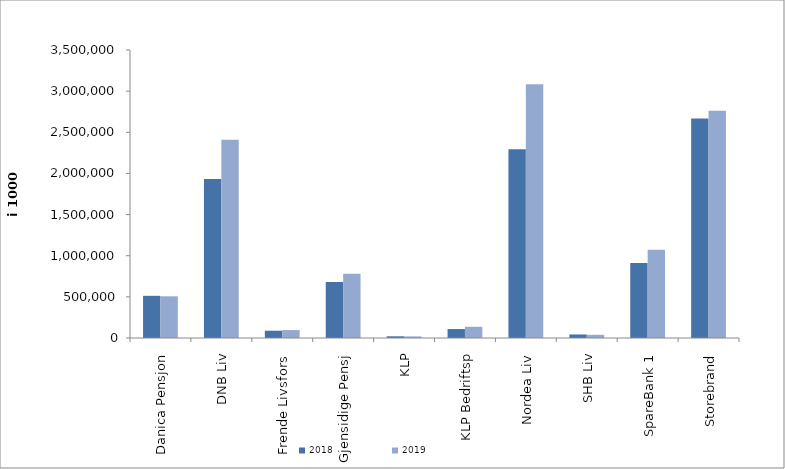
| Category | 2018 | 2019 |
|---|---|---|
| Danica Pensjon | 512553.305 | 506748.042 |
| DNB Liv | 1933331 | 2408062 |
| Frende Livsfors | 88637 | 96311 |
| Gjensidige Pensj | 681493 | 781465 |
| KLP | 20875.778 | 19489.256 |
| KLP Bedriftsp | 108569 | 135943 |
| Nordea Liv | 2294973.036 | 3083447.27 |
| SHB Liv | 42877 | 38700.716 |
| SpareBank 1 | 912443.094 | 1073722.176 |
| Storebrand | 2667749.476 | 2762007.889 |